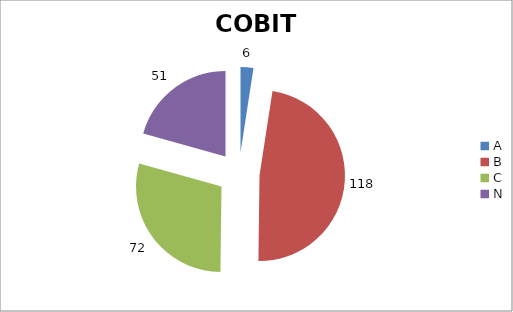
| Category | Series 0 |
|---|---|
| A | 6 |
| B | 118 |
| C | 72 |
| N | 51 |